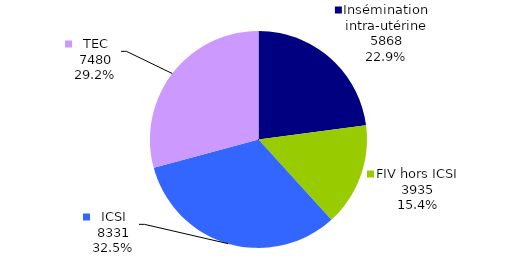
| Category | Enfants nés vivants |
|---|---|
| Insémination intra-utérine | 5868 |
| FIV hors ICSI | 3935 |
| ICSI | 8331 |
| TEC | 7480 |